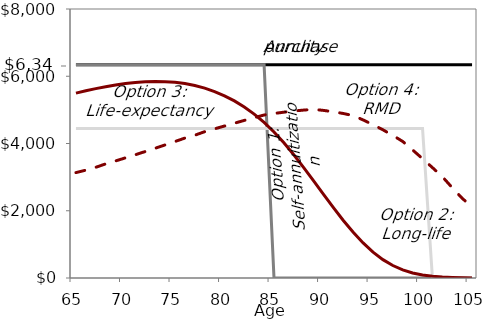
| Category | Annuity purchase | Option 1:
Self-annuitized  | Option 2:
Long-life | Option 3:
Life-expectancy | Option 4: RMD |
|---|---|---|---|---|---|
| 65.0 | 6340 | 6340 | 4446.97 | 5497.6 | 3134.796 |
| 66.0 | 6340 | 6340 | 4446.97 | 5567.35 | 3208.076 |
| 67.0 | 6340 | 6340 | 4446.97 | 5631.88 | 3293.377 |
| 68.0 | 6340 | 6340 | 4446.97 | 5687.55 | 3392.178 |
| 69.0 | 6340 | 6340 | 4446.97 | 5739.075 | 3481.597 |
| 70.0 | 6340 | 6340 | 4446.97 | 5782.082 | 3572.957 |
| 71.0 | 6340 | 6340 | 4446.97 | 5814.907 | 3666.259 |
| 72.0 | 6340 | 6340 | 4446.97 | 5836.074 | 3761.496 |
| 73.0 | 6340 | 6340 | 4446.97 | 5844.584 | 3858.655 |
| 74.0 | 6340 | 6340 | 4446.97 | 5839.587 | 3957.715 |
| 75.0 | 6340 | 6340 | 4446.97 | 5819.762 | 4058.646 |
| 76.0 | 6340 | 6340 | 4446.97 | 5782.41 | 4161.403 |
| 77.0 | 6340 | 6340 | 4446.97 | 5724.8 | 4245.809 |
| 78.0 | 6340 | 6340 | 4446.97 | 5645.596 | 4351.641 |
| 79.0 | 6340 | 6340 | 4446.97 | 5544.012 | 4436.219 |
| 80.0 | 6340 | 6340 | 4446.97 | 5418.719 | 4520.436 |
| 81.0 | 6340 | 6340 | 4446.97 | 5267.525 | 4604.026 |
| 82.0 | 6340 | 6340 | 4446.97 | 5087.388 | 4686.683 |
| 83.0 | 6340 | 6340 | 4446.97 | 4875.01 | 4768.053 |
| 84.0 | 6340 | 6340 | 4446.97 | 4626.944 | 4847.725 |
| 85.0 | 6340 | 0 | 4446.97 | 4341.357 | 4891.945 |
| 86.0 | 6340 | 0 | 4446.97 | 4019.215 | 4931.496 |
| 87.0 | 6340 | 0 | 4446.97 | 3664.65 | 4965.723 |
| 88.0 | 6340 | 0 | 4446.97 | 3284.676 | 4993.875 |
| 89.0 | 6340 | 0 | 4446.97 | 2888.528 | 5015.099 |
| 90.0 | 6340 | 0 | 4446.97 | 2486.776 | 4984.304 |
| 91.0 | 6340 | 0 | 4446.97 | 2090.64 | 4943.691 |
| 92.0 | 6340 | 0 | 4446.97 | 1711.287 | 4892.316 |
| 93.0 | 6340 | 0 | 4446.97 | 1359.131 | 4829.123 |
| 94.0 | 6340 | 0 | 4446.97 | 1043.158 | 4700.7 |
| 95.0 | 6340 | 0 | 4446.97 | 770.19 | 4560.226 |
| 96.0 | 6340 | 0 | 4446.97 | 545.886 | 4407.092 |
| 97.0 | 6340 | 0 | 4446.97 | 370.885 | 4240.667 |
| 98.0 | 6340 | 0 | 4446.97 | 241.394 | 4060.289 |
| 99.0 | 6340 | 0 | 4446.97 | 150.527 | 3807.582 |
| 100.0 | 6340 | 0 | 4446.97 | 89.979 | 3548.303 |
| 101.0 | 6340 | 0 | 0 | 51.268 | 3283.083 |
| 102.0 | 6340 | 0 | 0 | 27.652 | 3012.676 |
| 103.0 | 6340 | 0 | 0 | 13.998 | 2685.337 |
| 104.0 | 6340 | 0 | 0 | 6.579 | 2370.769 |
| 105.0 | 6340 | 0 | 0 | 2.831 | 2116.307 |